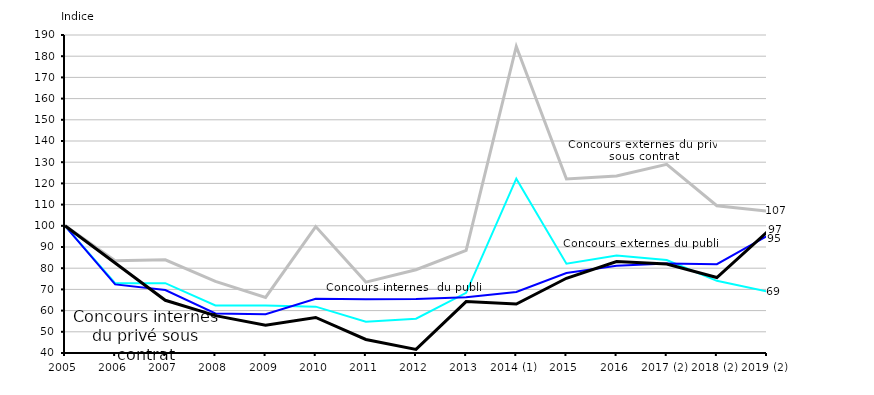
| Category | Concours externes du public  | Concours internes  du public | Concours externes du privé sous contrat | Concours internes du privé sous contrat |
|---|---|---|---|---|
| 2005 | 100 | 100 | 100 | 100 |
| 2006 | 72.905 | 72.355 | 83.473 | 82.432 |
| 2007 | 72.942 | 69.701 | 83.937 | 64.865 |
| 2008 | 62.451 | 58.68 | 73.816 | 57.617 |
| 2009 | 62.436 | 58.312 | 66.202 | 53.133 |
| 2010 | 61.858 | 65.536 | 99.629 | 56.757 |
| 2011 | 54.799 | 65.352 | 73.445 | 46.376 |
| 2012 | 56.158 | 65.463 | 79.294 | 41.708 |
| 2013 | 68.376 | 66.273 | 88.394 | 64.251 |
| 2014 (1) | 122.214 | 68.817 | 184.587 | 63.084 |
| 2015 | 82.104 | 77.737 | 122.098 | 75.246 |
| 2016 | 86.017 | 81.128 | 123.491 | 83.108 |
| 2017 (2) | 83.831 | 82.234 | 129 | 82 |
| 2018 (2) | 74.054 | 81.902 | 109.471 | 75.614 |
| 2019 (2) | 69.052 | 95.135 | 106.964 | 97.052 |